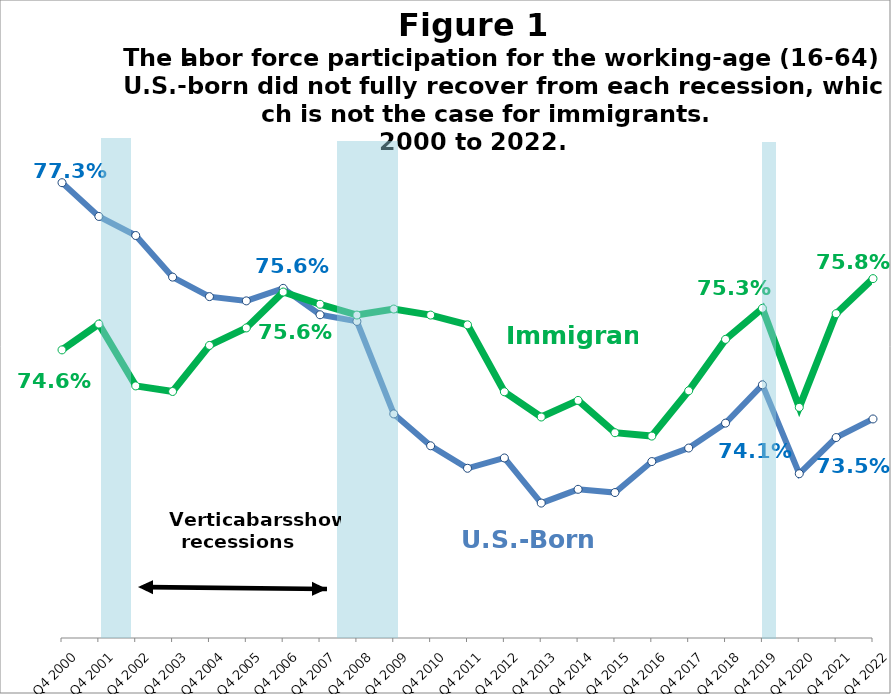
| Category | U.S.-born | Immigrant |
|---|---|---|
| Q4 2000 | 0.773 | 0.746 |
| Q4 2001 | 0.768 | 0.751 |
| Q4 2002 | 0.765 | 0.741 |
| Q4 2003 | 0.758 | 0.74 |
| Q4 2004 | 0.755 | 0.747 |
| Q4 2005 | 0.754 | 0.75 |
| Q4 2006 | 0.756 | 0.756 |
| Q4 2007 | 0.752 | 0.754 |
| Q4 2008 | 0.751 | 0.752 |
| Q4 2009 | 0.736 | 0.753 |
| Q4 2010 | 0.731 | 0.752 |
| Q4 2011 | 0.727 | 0.75 |
| Q4 2012 | 0.729 | 0.74 |
| Q4 2013 | 0.722 | 0.736 |
| Q4 2014 | 0.724 | 0.738 |
| Q4 2015 | 0.723 | 0.733 |
| Q4 2016 | 0.728 | 0.733 |
| Q4 2017 | 0.731 | 0.74 |
| Q4 2018 | 0.735 | 0.748 |
| Q4 2019 | 0.741 | 0.753 |
| Q4 2020 | 0.726 | 0.737 |
| Q4 2021 | 0.732 | 0.752 |
| Q4 2022 | 0.735 | 0.758 |